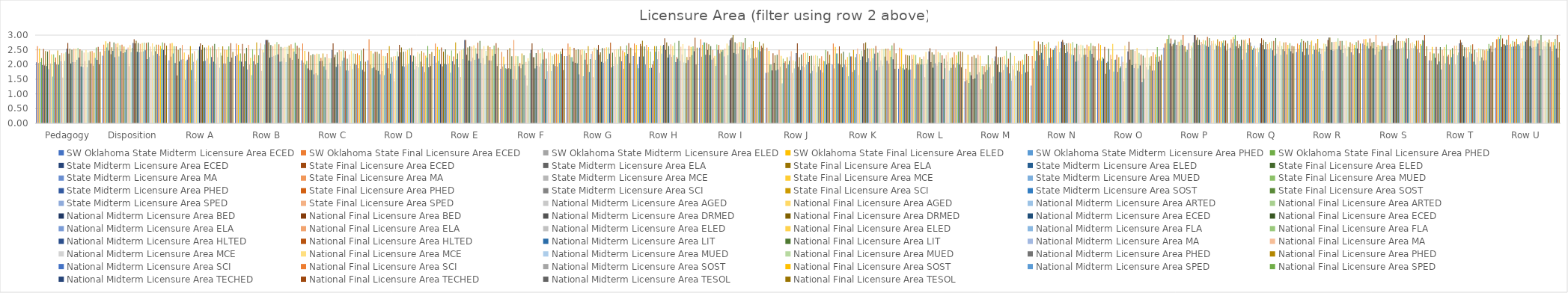
| Category | SW Oklahoma State | State | National |
|---|---|---|---|
| Pedagogy | 2.221 | 2.392 | 2.436 |
| Disposition | 2.719 | 2.58 | 2.643 |
| Row A | 2.625 | 2.454 | 2.429 |
| Row B | 2.375 | 2.727 | 2.571 |
| Row C | 2.125 | 2.364 | 2.095 |
| Row D | 2.375 | 2.273 | 2.429 |
| Row E | 2.5 | 2.454 | 2.571 |
| Row F | 1.875 | 2.091 | 2.286 |
| Row G | 2.25 | 2.454 | 2.571 |
| Row H | 1.875 | 2.454 | 2.571 |
| Row I | 2.75 | 2.546 | 2.714 |
| Row J | 2 | 2.454 | 2.333 |
| Row K | 2.375 | 2.546 | 2.381 |
| Row L | 2 | 2.273 | 2.429 |
| Row M | 1.75 | 2 | 2.286 |
| Row N | 2.5 | 2.636 | 2.619 |
| Row O | 2.25 | 2.091 | 2.333 |
| Row P | 3 | 2.727 | 2.714 |
| Row Q | 3 | 2.546 | 2.619 |
| Row R | 2.875 | 2.546 | 2.714 |
| Row S | 2.75 | 2.727 | 2.619 |
| Row T | 2.375 | 2.636 | 2.762 |
| Row U | 3 | 2.727 | 2.762 |